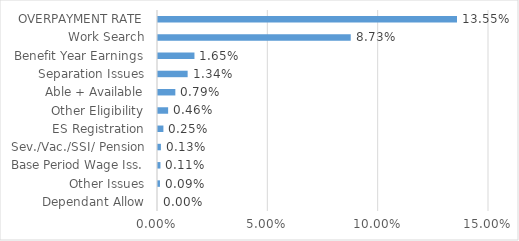
| Category | Series 0 |
|---|---|
| Dependant Allow | 0 |
| Other Issues | 0.001 |
| Base Period Wage Iss. | 0.001 |
| Sev./Vac./SSI/ Pension | 0.001 |
| ES Registration | 0.002 |
| Other Eligibility | 0.005 |
| Able + Available | 0.008 |
| Separation Issues | 0.013 |
| Benefit Year Earnings | 0.017 |
| Work Search | 0.087 |
| OVERPAYMENT RATE | 0.136 |